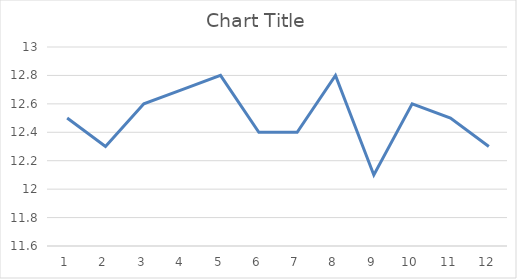
| Category | Series 0 |
|---|---|
| 0 | 12.5 |
| 1 | 12.3 |
| 2 | 12.6 |
| 3 | 12.7 |
| 4 | 12.8 |
| 5 | 12.4 |
| 6 | 12.4 |
| 7 | 12.8 |
| 8 | 12.1 |
| 9 | 12.6 |
| 10 | 12.5 |
| 11 | 12.3 |